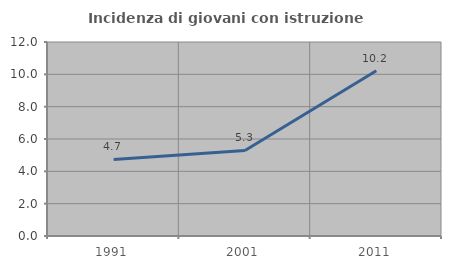
| Category | Incidenza di giovani con istruzione universitaria |
|---|---|
| 1991.0 | 4.734 |
| 2001.0 | 5.291 |
| 2011.0 | 10.219 |